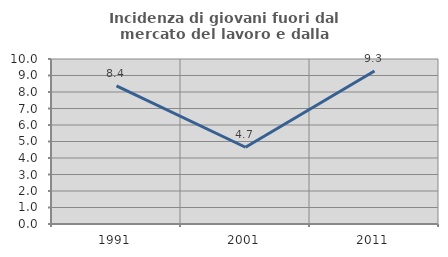
| Category | Incidenza di giovani fuori dal mercato del lavoro e dalla formazione  |
|---|---|
| 1991.0 | 8.37 |
| 2001.0 | 4.651 |
| 2011.0 | 9.272 |